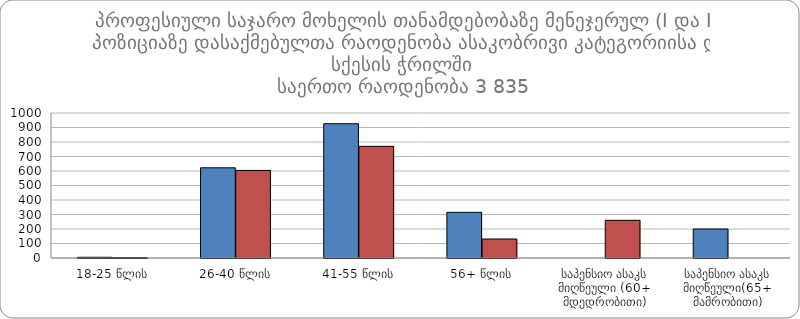
| Category |  მამრობითი |  მდედრობითი |
|---|---|---|
| 18-25 წლის | 5 | 2 |
| 26-40 წლის | 622 | 604 |
| 41-55 წლის | 926 | 770 |
| 56+ წლის | 315 | 131 |
| საპენსიო ასაკს მიღწეული (60+ მდედრობითი) | 0 | 260 |
| საპენსიო ასაკს მიღწეული(65+ მამრობითი) | 200 | 0 |